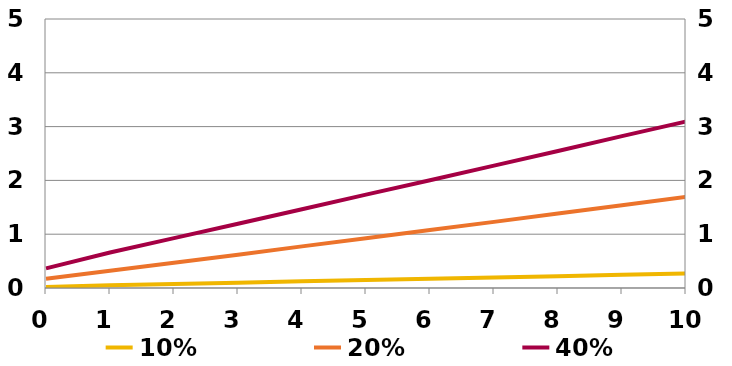
| Category | 10% | 20% |
|---|---|---|
| 0.0 | 0.019 | 0.173 |
| 1.0 | 0.052 | 0.319 |
| 2.0 | 0.075 | 0.47 |
| 3.0 | 0.099 | 0.62 |
| 4.0 | 0.124 | 0.774 |
| 5.0 | 0.147 | 0.924 |
| 6.0 | 0.172 | 1.076 |
| 7.0 | 0.195 | 1.229 |
| 8.0 | 0.22 | 1.383 |
| 9.0 | 0.244 | 1.539 |
| 10.0 | 0.268 | 1.692 |